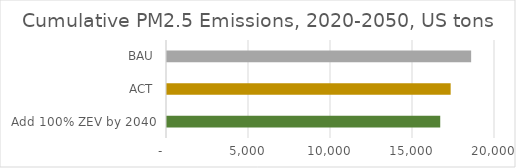
| Category | Cumulative PM2.5 Emissions, 2020-2050, US tons |
|---|---|
| Add 100% ZEV by 2040 | 16660.465 |
| ACT | 17296 |
| BAU | 18545 |